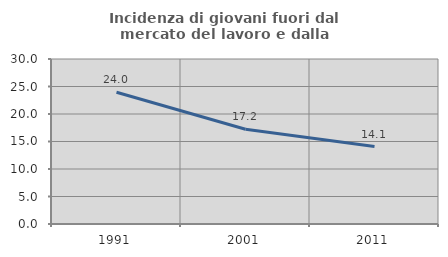
| Category | Incidenza di giovani fuori dal mercato del lavoro e dalla formazione  |
|---|---|
| 1991.0 | 23.961 |
| 2001.0 | 17.236 |
| 2011.0 | 14.091 |